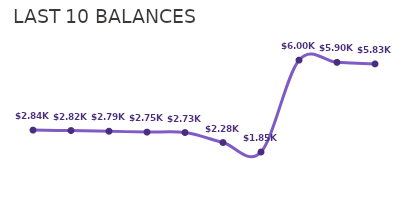
| Category | BALANCE (K) |
|---|---|
| 0 | 2.84 |
| 1 | 2.82 |
| 2 | 2.79 |
| 3 | 2.75 |
| 4 | 2.73 |
| 5 | 2.28 |
| 6 | 1.85 |
| 7 | 6 |
| 8 | 5.9 |
| 9 | 5.83 |